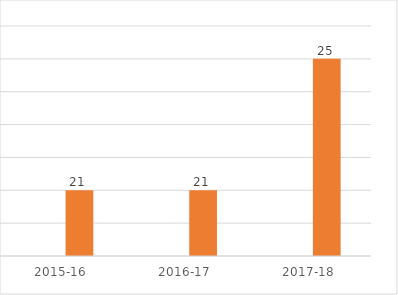
| Category | Series 0 | Series 1 |
|---|---|---|
| 2015-16 |  | 21 |
| 2016-17 |  | 21 |
| 2017-18 |  | 25 |